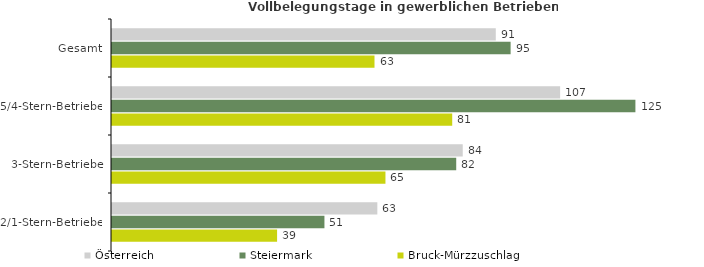
| Category | Österreich | Steiermark | Bruck-Mürzzuschlag |
|---|---|---|---|
| Gesamt | 91.375 | 94.907 | 62.501 |
| 5/4-Stern-Betriebe | 106.695 | 124.622 | 81.004 |
| 3-Stern-Betriebe | 83.508 | 81.957 | 65.108 |
| 2/1-Stern-Betriebe | 63.173 | 50.58 | 39.306 |